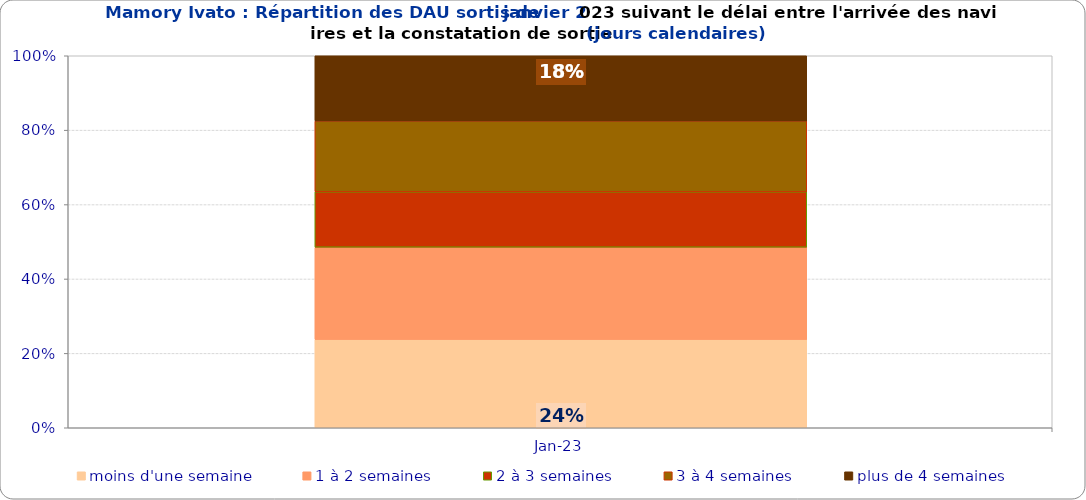
| Category | moins d'une semaine | 1 à 2 semaines | 2 à 3 semaines | 3 à 4 semaines | plus de 4 semaines |
|---|---|---|---|---|---|
| 2023-01-01 | 0.237 | 0.248 | 0.149 | 0.19 | 0.175 |